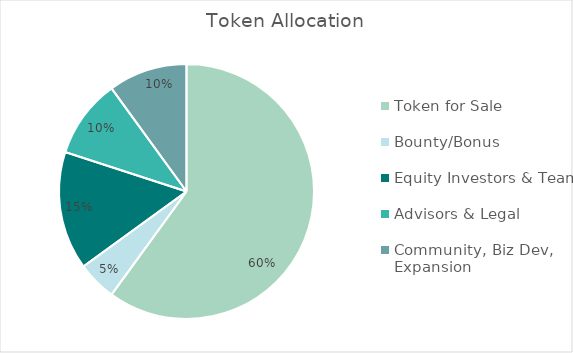
| Category | Allocation |
|---|---|
| Token for Sale | 0.6 |
| Bounty/Bonus | 0.05 |
| Equity Investors & Team | 0.15 |
| Advisors & Legal | 0.1 |
| Community, Biz Dev, Expansion | 0.1 |